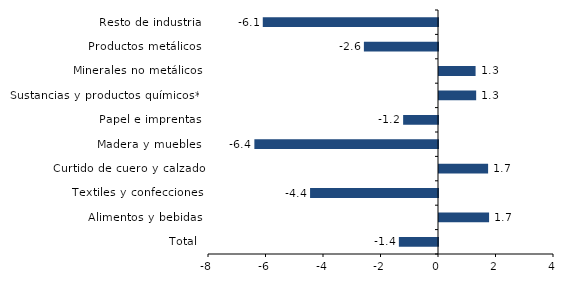
| Category | Series 0 |
|---|---|
| Total | -1.361 |
| Alimentos y bebidas | 1.742 |
| Textiles y confecciones | -4.45 |
| Curtido de cuero y calzado | 1.708 |
| Madera y muebles | -6.387 |
| Papel e imprentas | -1.213 |
| Sustancias y productos químicos** | 1.293 |
| Minerales no metálicos | 1.272 |
| Productos metálicos | -2.578 |
| Resto de industria | -6.095 |